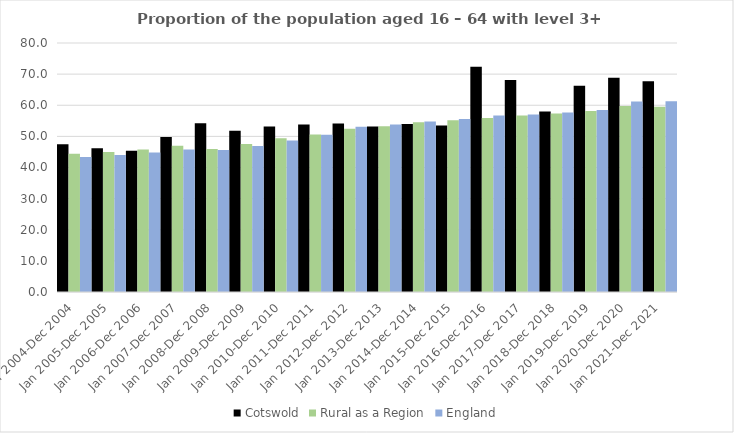
| Category | Cotswold | Rural as a Region | England |
|---|---|---|---|
| Jan 2004-Dec 2004 | 47.5 | 44.405 | 43.4 |
| Jan 2005-Dec 2005 | 46.2 | 44.973 | 44 |
| Jan 2006-Dec 2006 | 45.4 | 45.774 | 44.8 |
| Jan 2007-Dec 2007 | 49.8 | 46.968 | 45.8 |
| Jan 2008-Dec 2008 | 54.2 | 45.964 | 45.6 |
| Jan 2009-Dec 2009 | 51.8 | 47.59 | 46.9 |
| Jan 2010-Dec 2010 | 53.2 | 49.362 | 48.7 |
| Jan 2011-Dec 2011 | 53.8 | 50.602 | 50.5 |
| Jan 2012-Dec 2012 | 54.1 | 52.439 | 53.1 |
| Jan 2013-Dec 2013 | 53.2 | 53.276 | 53.8 |
| Jan 2014-Dec 2014 | 54 | 54.57 | 54.8 |
| Jan 2015-Dec 2015 | 53.5 | 55.16 | 55.6 |
| Jan 2016-Dec 2016 | 72.4 | 55.941 | 56.7 |
| Jan 2017-Dec 2017 | 68.1 | 56.689 | 57 |
| Jan 2018-Dec 2018 | 58 | 57.389 | 57.7 |
| Jan 2019-Dec 2019 | 66.3 | 58.147 | 58.5 |
| Jan 2020-Dec 2020 | 68.8 | 59.771 | 61.2 |
| Jan 2021-Dec 2021 | 67.7 | 59.54 | 61.3 |